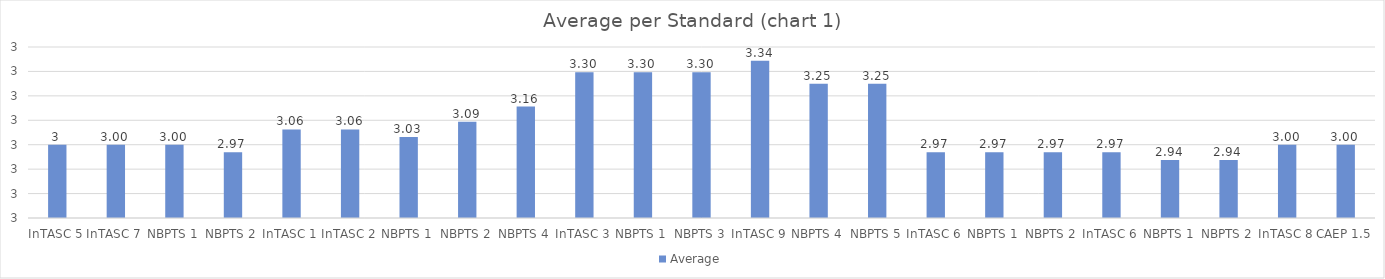
| Category | Average |
|---|---|
| InTASC 5 | 3 |
| InTASC 7 | 3 |
| NBPTS 1 | 3 |
| NBPTS 2 | 2.969 |
| InTASC 1 | 3.062 |
| InTASC 2 | 3.062 |
| NBPTS 1 | 3.031 |
| NBPTS 2 | 3.094 |
| NBPTS 4 | 3.156 |
| InTASC 3 | 3.297 |
| NBPTS 1 | 3.297 |
| NBPTS 3 | 3.297 |
| InTASC 9 | 3.344 |
| NBPTS 4 | 3.25 |
| NBPTS 5 | 3.25 |
| InTASC 6 | 2.969 |
| NBPTS 1 | 2.969 |
| NBPTS 2 | 2.969 |
| InTASC 6 | 2.969 |
| NBPTS 1 | 2.938 |
| NBPTS 2 | 2.938 |
| InTASC 8 | 3 |
| CAEP 1.5 | 3 |